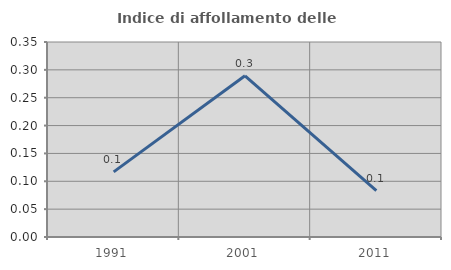
| Category | Indice di affollamento delle abitazioni  |
|---|---|
| 1991.0 | 0.117 |
| 2001.0 | 0.289 |
| 2011.0 | 0.083 |